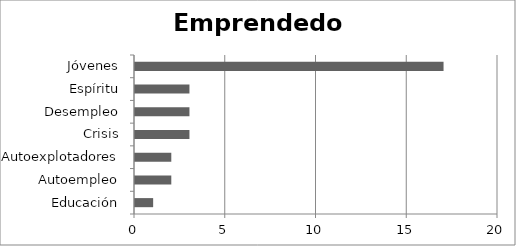
| Category | Emprendedor |
|---|---|
| Educación | 1 |
| Autoempleo | 2 |
| Autoexplotadores | 2 |
| Crisis | 3 |
| Desempleo | 3 |
| Espíritu | 3 |
| Jóvenes | 17 |